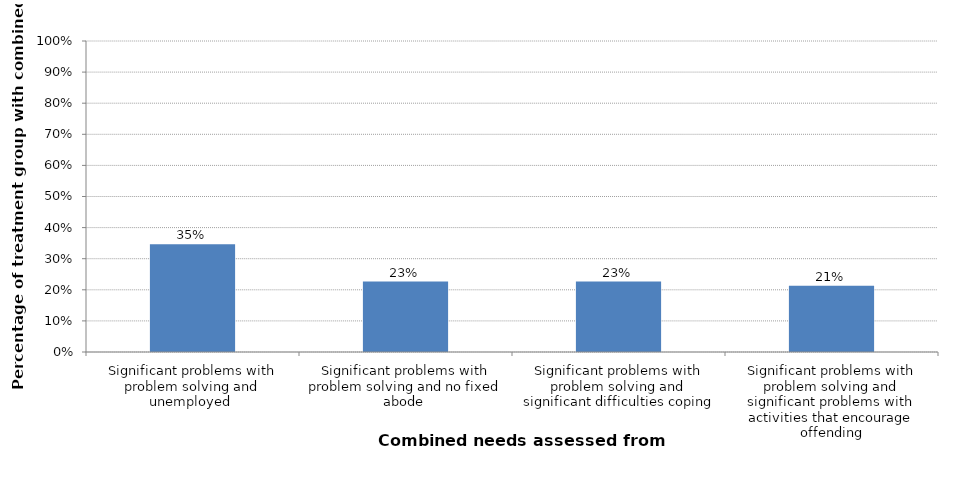
| Category | Percentage of treatment group with combined need |
|---|---|
| Significant problems with problem solving and unemployed  | 0.347 |
| Significant problems with problem solving and no fixed abode  | 0.227 |
| Significant problems with problem solving and significant difficulties coping | 0.227 |
| Significant problems with problem solving and significant problems with activities that encourage offending | 0.213 |